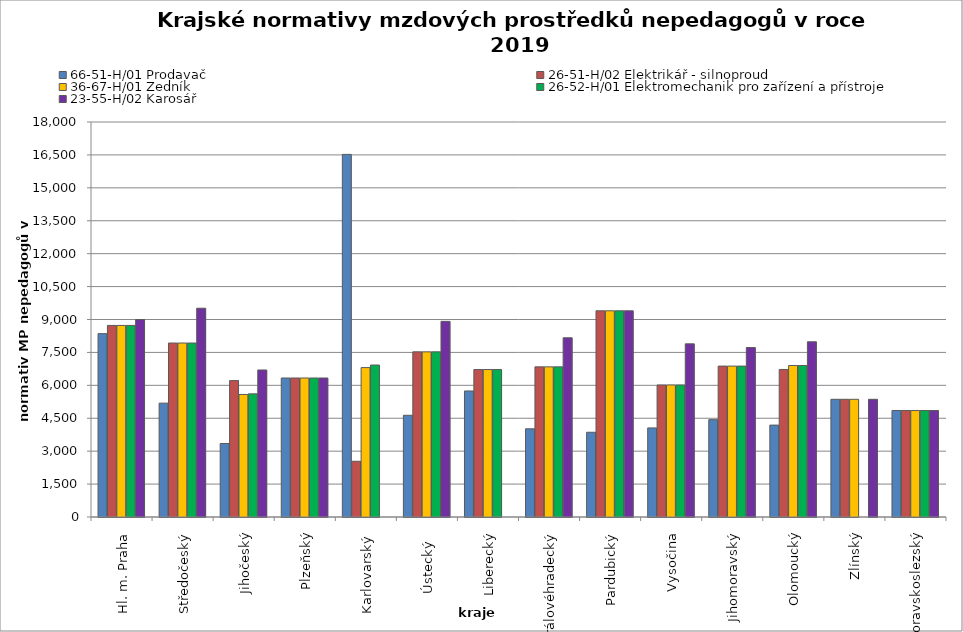
| Category | 66-51-H/01 Prodavač | 26-51-H/02 Elektrikář - silnoproud | 36-67-H/01 Zedník | 26-52-H/01 Elektromechanik pro zařízení a přístroje | 23-55-H/02 Karosář |
|---|---|---|---|---|---|
| Hl. m. Praha | 8355.429 | 8729.552 | 8729.552 | 8729.552 | 8998.154 |
| Středočeský | 5189.236 | 7928 | 7928 | 7928 | 9513.6 |
| Jihočeský | 3349.87 | 6215.207 | 5582.85 | 5610.992 | 6699.74 |
| Plzeňský | 6334.615 | 6334.615 | 6334.615 | 6334.615 | 6334.615 |
| Karlovarský  | 16523.517 | 2539.23 | 6808.989 | 6925.714 | 0 |
| Ústecký   | 4634.614 | 7525.659 | 7525.659 | 7525.659 | 8916.114 |
| Liberecký | 5743.214 | 6719.126 | 6719.126 | 6719.126 | 0 |
| Královéhradecký | 4018.825 | 6842.485 | 6842.485 | 6842.485 | 8166.624 |
| Pardubický | 3861.37 | 9396 | 9396 | 9396 | 9396 |
| Vysočina | 4059.837 | 6017.118 | 6017.118 | 6017.118 | 7890.552 |
| Jihomoravský | 4435.779 | 6876.388 | 6876.388 | 6876.388 | 7722.361 |
| Olomoucký | 4187.963 | 6723.331 | 6904.114 | 6904.114 | 7983.955 |
| Zlínský | 5363.265 | 5363.265 | 5363.265 | 0 | 5363.265 |
| Moravskoslezský | 4853.235 | 4853.235 | 4853.235 | 4853.235 | 4853.235 |